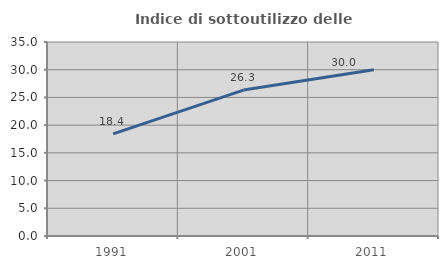
| Category | Indice di sottoutilizzo delle abitazioni  |
|---|---|
| 1991.0 | 18.426 |
| 2001.0 | 26.329 |
| 2011.0 | 29.991 |